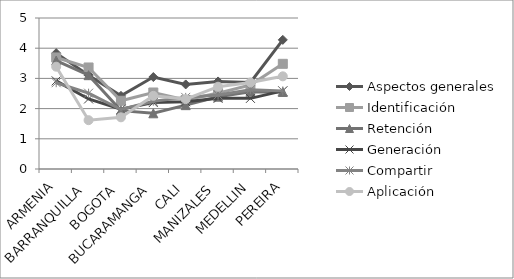
| Category | Aspectos generales | Identificación | Retención | Generación  | Compartir  | Aplicación  |
|---|---|---|---|---|---|---|
| ARMENIA | 3.837 | 3.694 | 3.592 | 2.918 | 2.857 | 3.388 |
| BARRANQUILLA | 3.106 | 3.362 | 3.106 | 2.319 | 2.511 | 1.617 |
| BOGOTA | 2.423 | 2.26 | 1.933 | 1.981 | 1.971 | 1.712 |
| BUCARAMANGA | 3.044 | 2.533 | 1.844 | 2.2 | 2.244 | 2.422 |
| CALI | 2.8 | 2.286 | 2.114 | 2.229 | 2.371 | 2.314 |
| MANIZALES | 2.899 | 2.514 | 2.394 | 2.339 | 2.45 | 2.725 |
| MEDELLIN | 2.864 | 2.78 | 2.559 | 2.339 | 2.627 | 2.864 |
| PEREIRA | 4.276 | 3.483 | 2.552 | 2.586 | 2.586 | 3.069 |